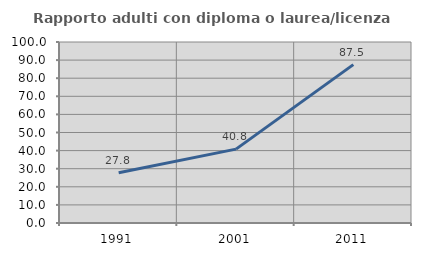
| Category | Rapporto adulti con diploma o laurea/licenza media  |
|---|---|
| 1991.0 | 27.778 |
| 2001.0 | 40.816 |
| 2011.0 | 87.5 |